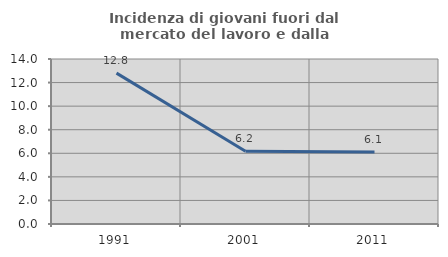
| Category | Incidenza di giovani fuori dal mercato del lavoro e dalla formazione  |
|---|---|
| 1991.0 | 12.801 |
| 2001.0 | 6.167 |
| 2011.0 | 6.111 |